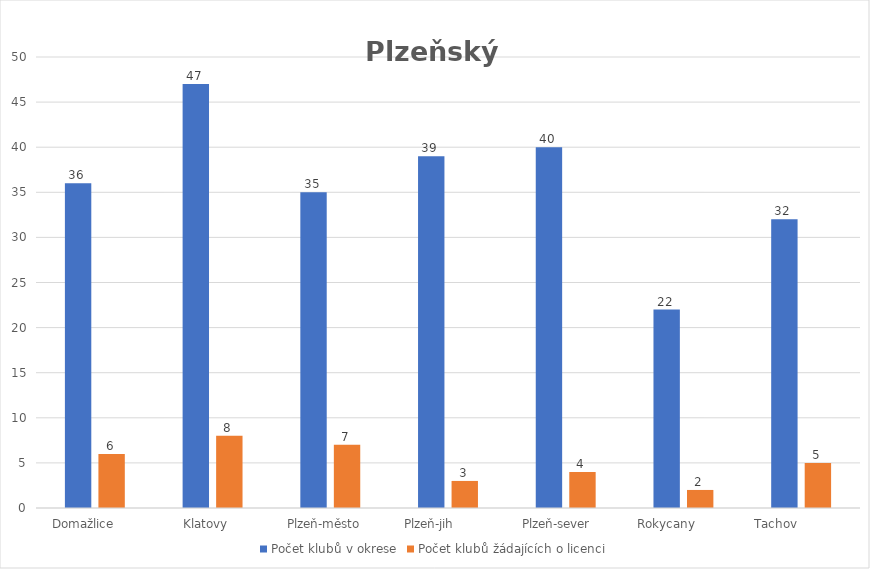
| Category | Počet klubů v okrese | Počet klubů žádajících o licenci |
|---|---|---|
| Domažlice      | 36 | 6 |
| Klatovy    | 47 | 8 |
| Plzeň-město   | 35 | 7 |
| Plzeň-jih          | 39 | 3 |
| Plzeň-sever     | 40 | 4 |
| Rokycany         | 22 | 2 |
| Tachov             | 32 | 5 |